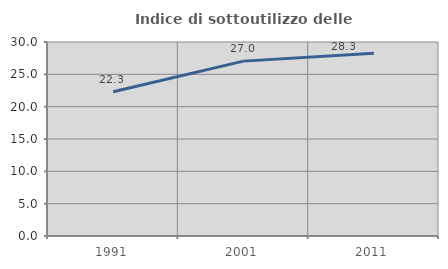
| Category | Indice di sottoutilizzo delle abitazioni  |
|---|---|
| 1991.0 | 22.299 |
| 2001.0 | 27.042 |
| 2011.0 | 28.266 |